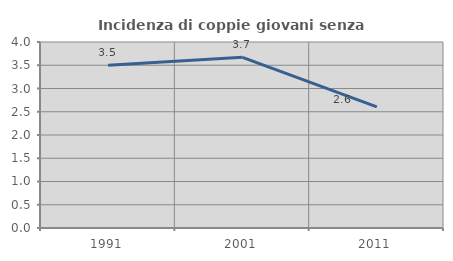
| Category | Incidenza di coppie giovani senza figli |
|---|---|
| 1991.0 | 3.499 |
| 2001.0 | 3.67 |
| 2011.0 | 2.606 |